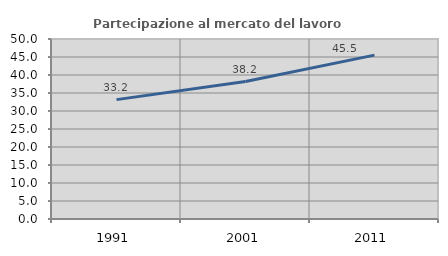
| Category | Partecipazione al mercato del lavoro  femminile |
|---|---|
| 1991.0 | 33.158 |
| 2001.0 | 38.182 |
| 2011.0 | 45.521 |